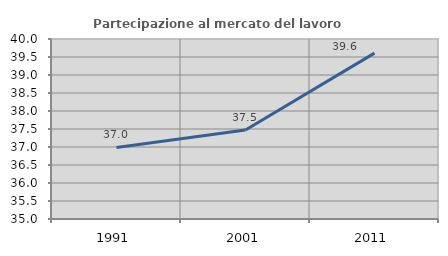
| Category | Partecipazione al mercato del lavoro  femminile |
|---|---|
| 1991.0 | 36.986 |
| 2001.0 | 37.473 |
| 2011.0 | 39.608 |